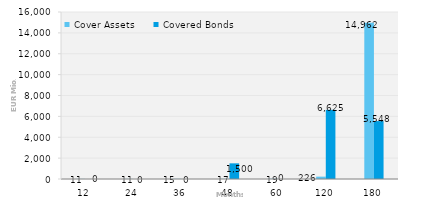
| Category | Cover Assets | Covered Bonds |
|---|---|---|
| 12.0 | 10.647 | 0 |
| 24.0 | 10.514 | 0 |
| 36.0 | 15.104 | 0 |
| 48.0 | 16.986 | 1500 |
| 60.0 | 19.239 | 0 |
| 120.0 | 225.992 | 6625 |
| 180.0 | 14961.518 | 5548 |